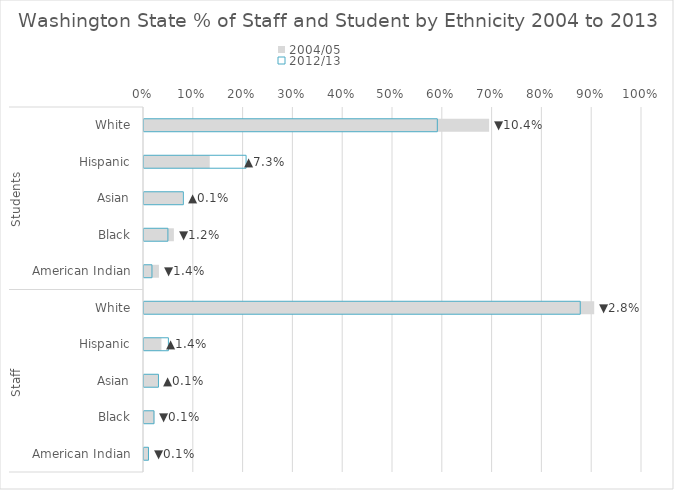
| Category | 2004/05 | 2012/13 |
|---|---|---|
| 0 | 0.01 | 0.009 |
| 1 | 0.021 | 0.02 |
| 2 | 0.028 | 0.029 |
| 3 | 0.035 | 0.049 |
| 4 | 0.904 | 0.876 |
| 5 | 0.03 | 0.016 |
| 6 | 0.06 | 0.048 |
| 7 | 0.078 | 0.079 |
| 8 | 0.132 | 0.205 |
| 9 | 0.693 | 0.589 |